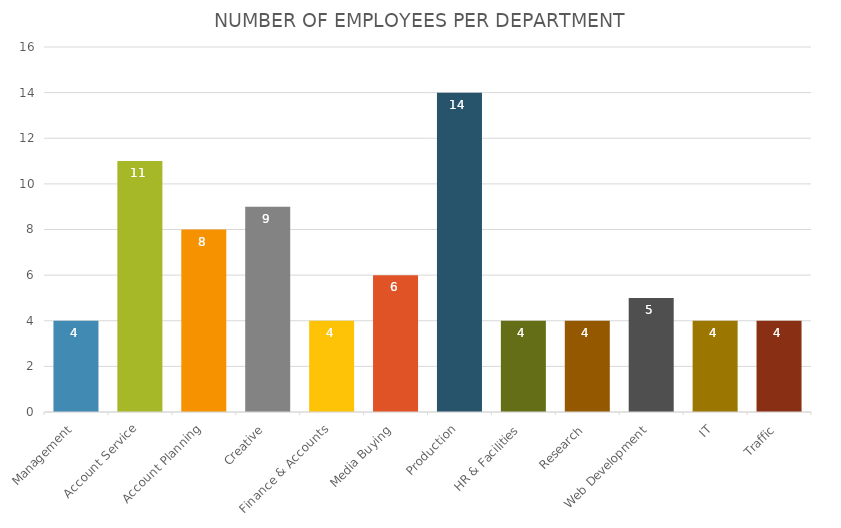
| Category | EMPLOYEES |
|---|---|
| Management | 4 |
| Account Service | 11 |
| Account Planning | 8 |
| Creative | 9 |
| Finance & Accounts | 4 |
| Media Buying | 6 |
| Production | 14 |
| HR & Facilities | 4 |
| Research | 4 |
| Web Development | 5 |
| IT | 4 |
| Traffic | 4 |